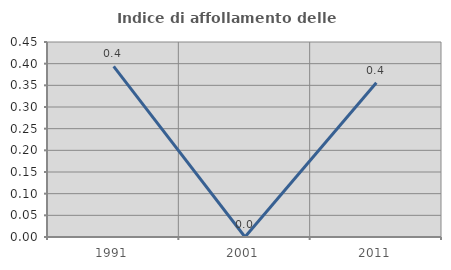
| Category | Indice di affollamento delle abitazioni  |
|---|---|
| 1991.0 | 0.394 |
| 2001.0 | 0 |
| 2011.0 | 0.356 |